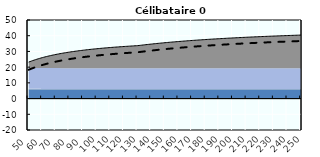
| Category | Coin fiscal moyen (somme des composantes) | Taux moyen d'imposition net en % du salaire brut |
|---|---|---|
| 50.0 | 23.215 | 18.339 |
| 51.0 | 23.549 | 18.694 |
| 52.0 | 23.869 | 19.035 |
| 53.0 | 24.178 | 19.363 |
| 54.0 | 24.475 | 19.679 |
| 55.0 | 24.762 | 19.984 |
| 56.0 | 25.038 | 20.278 |
| 57.0 | 25.304 | 20.561 |
| 58.0 | 25.562 | 20.835 |
| 59.0 | 25.81 | 21.099 |
| 60.0 | 26.05 | 21.355 |
| 61.0 | 26.283 | 21.602 |
| 62.0 | 26.508 | 21.841 |
| 63.0 | 26.726 | 22.073 |
| 64.0 | 26.937 | 22.297 |
| 65.0 | 27.141 | 22.514 |
| 66.0 | 27.339 | 22.725 |
| 67.0 | 27.532 | 22.93 |
| 68.0 | 27.718 | 23.128 |
| 69.0 | 27.9 | 23.321 |
| 70.0 | 28.076 | 23.509 |
| 71.0 | 28.247 | 23.691 |
| 72.0 | 28.413 | 23.868 |
| 73.0 | 28.575 | 24.04 |
| 74.0 | 28.733 | 24.207 |
| 75.0 | 28.886 | 24.37 |
| 76.0 | 29.035 | 24.529 |
| 77.0 | 29.18 | 24.683 |
| 78.0 | 29.322 | 24.834 |
| 79.0 | 29.46 | 24.981 |
| 80.0 | 29.595 | 25.124 |
| 81.0 | 29.726 | 25.264 |
| 82.0 | 29.854 | 25.4 |
| 83.0 | 29.979 | 25.533 |
| 84.0 | 30.101 | 25.662 |
| 85.0 | 30.22 | 25.789 |
| 86.0 | 30.337 | 25.913 |
| 87.0 | 30.45 | 26.034 |
| 88.0 | 30.561 | 26.152 |
| 89.0 | 30.67 | 26.267 |
| 90.0 | 30.776 | 26.38 |
| 91.0 | 30.88 | 26.491 |
| 92.0 | 30.982 | 26.599 |
| 93.0 | 31.081 | 26.705 |
| 94.0 | 31.178 | 26.808 |
| 95.0 | 31.274 | 26.909 |
| 96.0 | 31.367 | 27.009 |
| 97.0 | 31.458 | 27.106 |
| 98.0 | 31.548 | 27.201 |
| 99.0 | 31.635 | 27.294 |
| 100.0 | 31.721 | 27.386 |
| 101.0 | 31.806 | 27.475 |
| 102.0 | 31.888 | 27.563 |
| 103.0 | 31.969 | 27.649 |
| 104.0 | 32.048 | 27.734 |
| 105.0 | 32.126 | 27.816 |
| 106.0 | 32.203 | 27.898 |
| 107.0 | 32.278 | 27.977 |
| 108.0 | 32.351 | 28.056 |
| 109.0 | 32.424 | 28.133 |
| 110.0 | 32.495 | 28.208 |
| 111.0 | 32.564 | 28.282 |
| 112.0 | 32.633 | 28.355 |
| 113.0 | 32.7 | 28.426 |
| 114.0 | 32.766 | 28.497 |
| 115.0 | 32.831 | 28.566 |
| 116.0 | 32.895 | 28.633 |
| 117.0 | 32.957 | 28.7 |
| 118.0 | 33.019 | 28.766 |
| 119.0 | 33.079 | 28.83 |
| 120.0 | 33.139 | 28.893 |
| 121.0 | 33.198 | 28.956 |
| 122.0 | 33.255 | 29.017 |
| 123.0 | 33.312 | 29.077 |
| 124.0 | 33.368 | 29.137 |
| 125.0 | 33.423 | 29.195 |
| 126.0 | 33.477 | 29.252 |
| 127.0 | 33.53 | 29.309 |
| 128.0 | 33.582 | 29.364 |
| 129.0 | 33.634 | 29.419 |
| 130.0 | 33.684 | 29.473 |
| 131.0 | 33.791 | 29.587 |
| 132.0 | 33.896 | 29.699 |
| 133.0 | 34 | 29.809 |
| 134.0 | 34.103 | 29.918 |
| 135.0 | 34.204 | 30.025 |
| 136.0 | 34.303 | 30.131 |
| 137.0 | 34.401 | 30.235 |
| 138.0 | 34.497 | 30.338 |
| 139.0 | 34.592 | 30.439 |
| 140.0 | 34.686 | 30.539 |
| 141.0 | 34.779 | 30.637 |
| 142.0 | 34.87 | 30.734 |
| 143.0 | 34.96 | 30.83 |
| 144.0 | 35.048 | 30.924 |
| 145.0 | 35.136 | 31.017 |
| 146.0 | 35.222 | 31.108 |
| 147.0 | 35.307 | 31.199 |
| 148.0 | 35.391 | 31.288 |
| 149.0 | 35.473 | 31.376 |
| 150.0 | 35.555 | 31.463 |
| 151.0 | 35.636 | 31.549 |
| 152.0 | 35.715 | 31.633 |
| 153.0 | 35.794 | 31.717 |
| 154.0 | 35.871 | 31.799 |
| 155.0 | 35.948 | 31.88 |
| 156.0 | 36.023 | 31.96 |
| 157.0 | 36.098 | 32.04 |
| 158.0 | 36.171 | 32.118 |
| 159.0 | 36.244 | 32.195 |
| 160.0 | 36.315 | 32.271 |
| 161.0 | 36.386 | 32.347 |
| 162.0 | 36.456 | 32.421 |
| 163.0 | 36.525 | 32.495 |
| 164.0 | 36.594 | 32.567 |
| 165.0 | 36.661 | 32.639 |
| 166.0 | 36.728 | 32.71 |
| 167.0 | 36.793 | 32.78 |
| 168.0 | 36.858 | 32.849 |
| 169.0 | 36.923 | 32.917 |
| 170.0 | 36.986 | 32.985 |
| 171.0 | 37.049 | 33.052 |
| 172.0 | 37.111 | 33.118 |
| 173.0 | 37.172 | 33.183 |
| 174.0 | 37.233 | 33.247 |
| 175.0 | 37.293 | 33.311 |
| 176.0 | 37.352 | 33.374 |
| 177.0 | 37.411 | 33.436 |
| 178.0 | 37.469 | 33.498 |
| 179.0 | 37.526 | 33.559 |
| 180.0 | 37.583 | 33.619 |
| 181.0 | 37.639 | 33.679 |
| 182.0 | 37.694 | 33.738 |
| 183.0 | 37.749 | 33.796 |
| 184.0 | 37.803 | 33.853 |
| 185.0 | 37.857 | 33.91 |
| 186.0 | 37.91 | 33.967 |
| 187.0 | 37.962 | 34.023 |
| 188.0 | 38.014 | 34.078 |
| 189.0 | 38.065 | 34.132 |
| 190.0 | 38.116 | 34.186 |
| 191.0 | 38.166 | 34.24 |
| 192.0 | 38.216 | 34.293 |
| 193.0 | 38.265 | 34.345 |
| 194.0 | 38.314 | 34.397 |
| 195.0 | 38.362 | 34.448 |
| 196.0 | 38.41 | 34.499 |
| 197.0 | 38.457 | 34.549 |
| 198.0 | 38.504 | 34.599 |
| 199.0 | 38.55 | 34.648 |
| 200.0 | 38.596 | 34.697 |
| 201.0 | 38.642 | 34.745 |
| 202.0 | 38.687 | 34.793 |
| 203.0 | 38.731 | 34.841 |
| 204.0 | 38.775 | 34.887 |
| 205.0 | 38.819 | 34.934 |
| 206.0 | 38.862 | 34.98 |
| 207.0 | 38.905 | 35.025 |
| 208.0 | 38.947 | 35.07 |
| 209.0 | 38.989 | 35.115 |
| 210.0 | 39.031 | 35.159 |
| 211.0 | 39.072 | 35.203 |
| 212.0 | 39.113 | 35.246 |
| 213.0 | 39.153 | 35.289 |
| 214.0 | 39.193 | 35.332 |
| 215.0 | 39.233 | 35.374 |
| 216.0 | 39.272 | 35.416 |
| 217.0 | 39.311 | 35.457 |
| 218.0 | 39.35 | 35.498 |
| 219.0 | 39.388 | 35.539 |
| 220.0 | 39.426 | 35.579 |
| 221.0 | 39.463 | 35.619 |
| 222.0 | 39.5 | 35.659 |
| 223.0 | 39.537 | 35.698 |
| 224.0 | 39.574 | 35.737 |
| 225.0 | 39.61 | 35.775 |
| 226.0 | 39.646 | 35.813 |
| 227.0 | 39.681 | 35.851 |
| 228.0 | 39.717 | 35.889 |
| 229.0 | 39.752 | 35.926 |
| 230.0 | 39.786 | 35.963 |
| 231.0 | 39.821 | 35.999 |
| 232.0 | 39.855 | 36.035 |
| 233.0 | 39.888 | 36.071 |
| 234.0 | 39.922 | 36.107 |
| 235.0 | 39.955 | 36.142 |
| 236.0 | 39.988 | 36.177 |
| 237.0 | 40.021 | 36.212 |
| 238.0 | 40.053 | 36.246 |
| 239.0 | 40.085 | 36.28 |
| 240.0 | 40.117 | 36.314 |
| 241.0 | 40.148 | 36.348 |
| 242.0 | 40.18 | 36.381 |
| 243.0 | 40.211 | 36.414 |
| 244.0 | 40.242 | 36.447 |
| 245.0 | 40.272 | 36.479 |
| 246.0 | 40.302 | 36.512 |
| 247.0 | 40.332 | 36.543 |
| 248.0 | 40.362 | 36.575 |
| 249.0 | 40.392 | 36.607 |
| 250.0 | 40.421 | 36.638 |